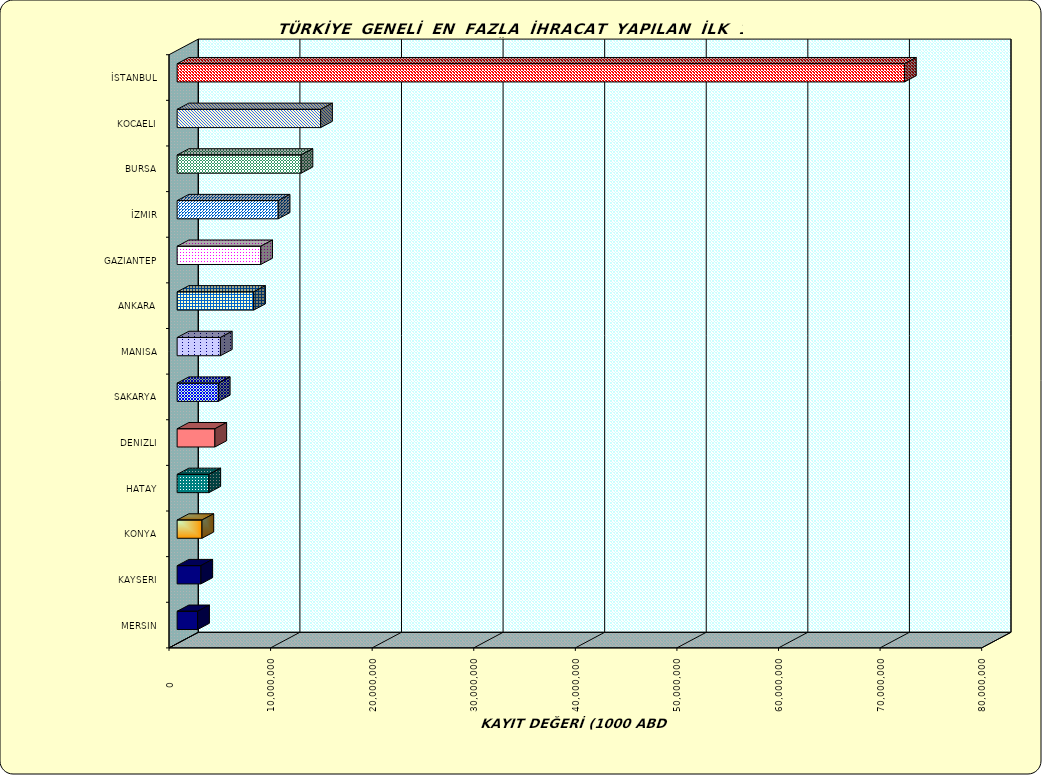
| Category | Series 0 |
|---|---|
| İSTANBUL | 71604783.636 |
| KOCAELI | 14127193.066 |
| BURSA | 12199875.746 |
| İZMIR | 9950455.837 |
| GAZIANTEP | 8230217.002 |
| ANKARA | 7533072.102 |
| MANISA | 4262836.002 |
| SAKARYA | 4058843.715 |
| DENIZLI | 3717193.31 |
| HATAY | 3127185.792 |
| KONYA | 2445125.071 |
| KAYSERI | 2339210.667 |
| MERSIN | 2020733.028 |